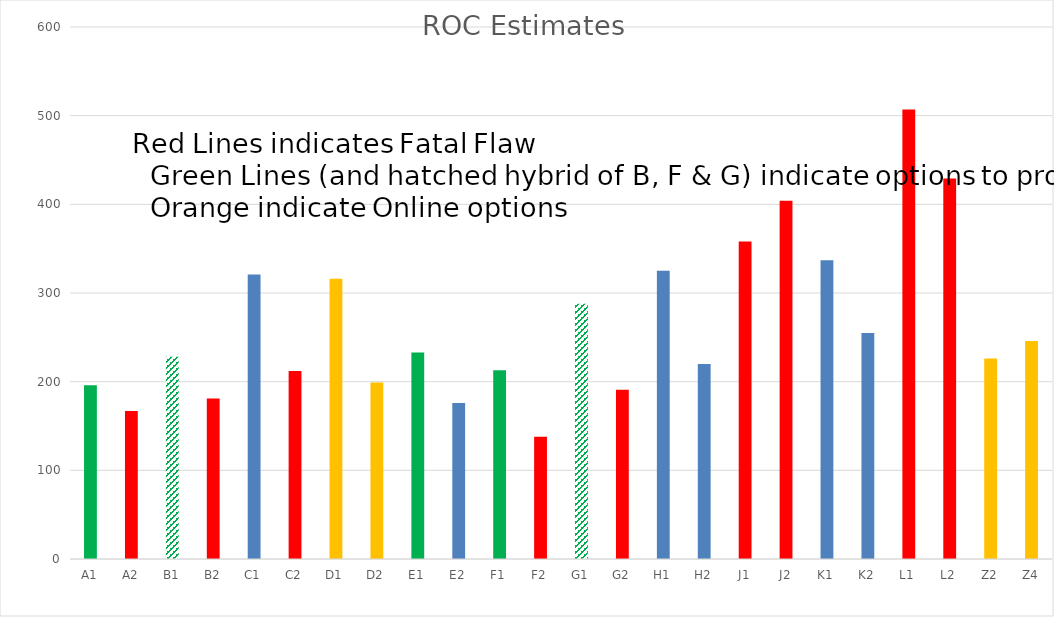
| Category | raw scores |
|---|---|
| A1 | 196 |
| A2 | 167 |
| B1 | 228 |
| B2 | 181 |
| C1 | 321 |
| C2 | 212 |
| D1 | 316 |
| D2 | 199 |
| E1 | 233 |
| E2 | 176 |
| F1 | 213 |
| F2 | 138 |
| G1 | 288 |
| G2 | 191 |
| H1 | 325 |
| H2 | 220 |
| J1 | 358 |
| J2 | 404 |
| K1 | 337 |
| K2 | 255 |
| L1 | 507 |
| L2 | 429 |
| Z2 | 226 |
| Z4 | 246 |